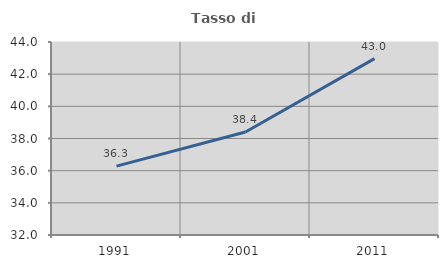
| Category | Tasso di occupazione   |
|---|---|
| 1991.0 | 36.285 |
| 2001.0 | 38.407 |
| 2011.0 | 42.967 |